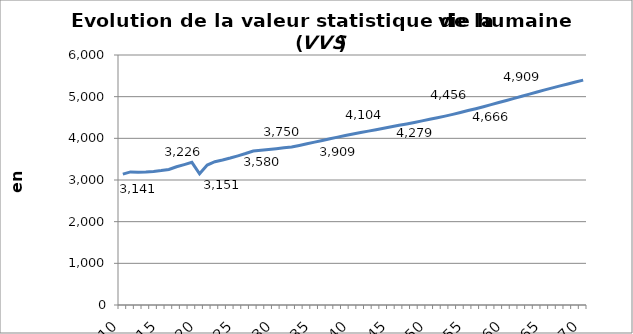
| Category | Valeur statistique de la vie humaine |
|---|---|
| 2010.0 | 3140620.998 |
| 2011.0 | 3193645.225 |
| 2012.0 | 3188530.171 |
| 2013.0 | 3191082.641 |
| 2014.0 | 3204691.838 |
| 2015.0 | 3226132.014 |
| 2016.0 | 3252650.023 |
| 2017.0 | 3318619.344 |
| 2018.0 | 3369530.589 |
| 2019.0 | 3423864.48 |
| 2020.0 | 3150613.932 |
| 2021.0 | 3359386.919 |
| 2022.0 | 3438867.302 |
| 2023.0 | 3479589.948 |
| 2024.0 | 3527304.503 |
| 2025.0 | 3580402.397 |
| 2026.0 | 3634782.384 |
| 2027.0 | 3694066.545 |
| 2028.0 | 3711962.067 |
| 2029.0 | 3729961.208 |
| 2030.0 | 3749906.215 |
| 2031.0 | 3771445.253 |
| 2032.0 | 3792345.832 |
| 2033.0 | 3829269.103 |
| 2034.0 | 3868094.099 |
| 2035.0 | 3909272.925 |
| 2036.0 | 3949374.648 |
| 2037.0 | 3988372.984 |
| 2038.0 | 4028226.106 |
| 2039.0 | 4067341.906 |
| 2040.0 | 4103646.586 |
| 2041.0 | 4138671.763 |
| 2042.0 | 4173180.819 |
| 2043.0 | 4207960.56 |
| 2044.0 | 4243822.829 |
| 2045.0 | 4279487.185 |
| 2046.0 | 4312354.86 |
| 2047.0 | 4346223.041 |
| 2048.0 | 4381544.66 |
| 2049.0 | 4419226.795 |
| 2050.0 | 4455796.415 |
| 2051.0 | 4493456.671 |
| 2052.0 | 4533585.835 |
| 2053.0 | 4575333.68 |
| 2054.0 | 4619689.769 |
| 2055.0 | 4666231.808 |
| 2056.0 | 4711707.068 |
| 2057.0 | 4759326.496 |
| 2058.0 | 4808131.997 |
| 2059.0 | 4858561.339 |
| 2060.0 | 4909124.037 |
| 2061.0 | 4959247.79 |
| 2062.0 | 5010327.82 |
| 2063.0 | 5062318.406 |
| 2064.0 | 5113656.382 |
| 2065.0 | 5163238.898 |
| 2066.0 | 5210444.558 |
| 2067.0 | 5258298.938 |
| 2068.0 | 5305748.741 |
| 2069.0 | 5352779.435 |
| 2070.0 | 5397790.47 |